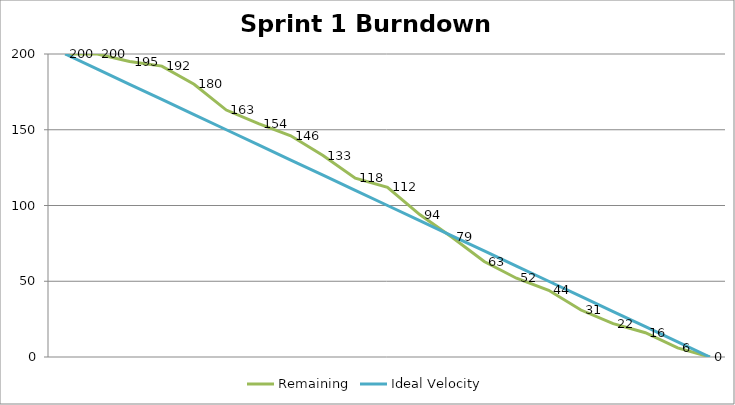
| Category | Remaining | Ideal Velocity |
|---|---|---|
| Initial Value | 200 | 200 |